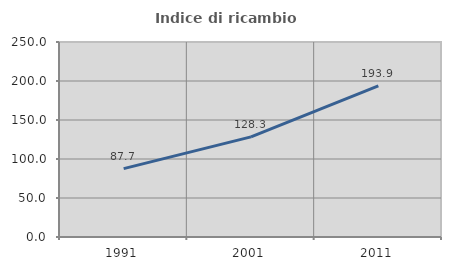
| Category | Indice di ricambio occupazionale  |
|---|---|
| 1991.0 | 87.671 |
| 2001.0 | 128.315 |
| 2011.0 | 193.863 |